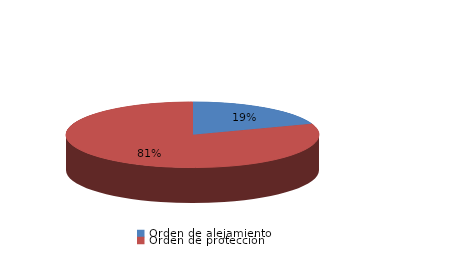
| Category | Series 0 |
|---|---|
| Orden de alejamiento | 52 |
| Orden de protección | 215 |